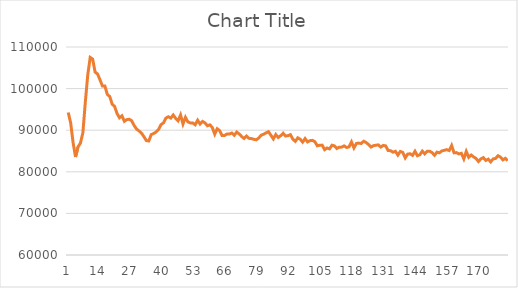
| Category | Series 1 |
|---|---|
| 0 | 94258.4 |
| 1 | 91768.1 |
| 2 | 86979.5 |
| 3 | 83569.5 |
| 4 | 85968.8 |
| 5 | 86906.7 |
| 6 | 89365.2 |
| 7 | 96721.6 |
| 8 | 103303 |
| 9 | 107485 |
| 10 | 107093 |
| 11 | 103980 |
| 12 | 103514 |
| 13 | 102135 |
| 14 | 100640 |
| 15 | 100643 |
| 16 | 98624 |
| 17 | 98095.3 |
| 18 | 96273.6 |
| 19 | 95706.8 |
| 20 | 94004.2 |
| 21 | 92986.4 |
| 22 | 93454.6 |
| 23 | 92147.8 |
| 24 | 92544.5 |
| 25 | 92630.1 |
| 26 | 92267.9 |
| 27 | 91119.6 |
| 28 | 90271.1 |
| 29 | 89819.4 |
| 30 | 89298 |
| 31 | 88439.3 |
| 32 | 87503.3 |
| 33 | 87412.1 |
| 34 | 88945.3 |
| 35 | 89203.3 |
| 36 | 89572.6 |
| 37 | 90182.5 |
| 38 | 91333 |
| 39 | 91756.2 |
| 40 | 92910.4 |
| 41 | 93235.5 |
| 42 | 92905.2 |
| 43 | 93649.5 |
| 44 | 92846.4 |
| 45 | 92267.5 |
| 46 | 93656.9 |
| 47 | 91484.4 |
| 48 | 93086.8 |
| 49 | 92000.9 |
| 50 | 91752.2 |
| 51 | 91755.6 |
| 52 | 91304.6 |
| 53 | 92402.4 |
| 54 | 91488.2 |
| 55 | 92113.9 |
| 56 | 91770.9 |
| 57 | 91073.4 |
| 58 | 91286.4 |
| 59 | 90654.1 |
| 60 | 89048.9 |
| 61 | 90350.4 |
| 62 | 89894.3 |
| 63 | 88718.6 |
| 64 | 88725.9 |
| 65 | 89082.3 |
| 66 | 89076.1 |
| 67 | 89319.7 |
| 68 | 88788.1 |
| 69 | 89549.7 |
| 70 | 89095.8 |
| 71 | 88488.3 |
| 72 | 88013.6 |
| 73 | 88580.1 |
| 74 | 88049.4 |
| 75 | 87979.7 |
| 76 | 87813.4 |
| 77 | 87688 |
| 78 | 88103.8 |
| 79 | 88796 |
| 80 | 89029.9 |
| 81 | 89336.9 |
| 82 | 89636.4 |
| 83 | 88790.3 |
| 84 | 87895.4 |
| 85 | 88969.5 |
| 86 | 88240.1 |
| 87 | 88673.6 |
| 88 | 89263.9 |
| 89 | 88595.3 |
| 90 | 88680.6 |
| 91 | 88929.1 |
| 92 | 87826.8 |
| 93 | 87317.4 |
| 94 | 88169 |
| 95 | 87829 |
| 96 | 87133 |
| 97 | 87984.8 |
| 98 | 87174.3 |
| 99 | 87493 |
| 100 | 87557.4 |
| 101 | 87233.4 |
| 102 | 86246.4 |
| 103 | 86378 |
| 104 | 86408.7 |
| 105 | 85318.6 |
| 106 | 85718.7 |
| 107 | 85508.7 |
| 108 | 86381.7 |
| 109 | 86237.1 |
| 110 | 85606.3 |
| 111 | 85920.7 |
| 112 | 85934.2 |
| 113 | 86227.3 |
| 114 | 85838.5 |
| 115 | 85995.7 |
| 116 | 87171.5 |
| 117 | 85741 |
| 118 | 86797.7 |
| 119 | 86896.4 |
| 120 | 86794.3 |
| 121 | 87353.1 |
| 122 | 87039.6 |
| 123 | 86561.2 |
| 124 | 85944.2 |
| 125 | 86283 |
| 126 | 86390.3 |
| 127 | 86463.9 |
| 128 | 85937.3 |
| 129 | 86347 |
| 130 | 86224 |
| 131 | 85118 |
| 132 | 85079 |
| 133 | 84709.2 |
| 134 | 84923.1 |
| 135 | 84011.4 |
| 136 | 84896.8 |
| 137 | 84659.1 |
| 138 | 83335.1 |
| 139 | 84259 |
| 140 | 84337 |
| 141 | 83942.9 |
| 142 | 84936.5 |
| 143 | 83864.1 |
| 144 | 84097.8 |
| 145 | 84972.2 |
| 146 | 84312.4 |
| 147 | 84918.2 |
| 148 | 84942.2 |
| 149 | 84607.7 |
| 150 | 83976.2 |
| 151 | 84733.1 |
| 152 | 84566 |
| 153 | 85012.9 |
| 154 | 85162 |
| 155 | 85324.1 |
| 156 | 85110.6 |
| 157 | 86314 |
| 158 | 84559.4 |
| 159 | 84612.3 |
| 160 | 84296.8 |
| 161 | 84447.4 |
| 162 | 83104.2 |
| 163 | 84896.1 |
| 164 | 83491.8 |
| 165 | 84036.8 |
| 166 | 83577.2 |
| 167 | 83208.1 |
| 168 | 82466.7 |
| 169 | 83107.7 |
| 170 | 83400.6 |
| 171 | 82732 |
| 172 | 83043.3 |
| 173 | 82373.3 |
| 174 | 83097 |
| 175 | 83214.8 |
| 176 | 83862.9 |
| 177 | 83542.2 |
| 178 | 82859.8 |
| 179 | 83241.4 |
| 180 | 82666.6 |